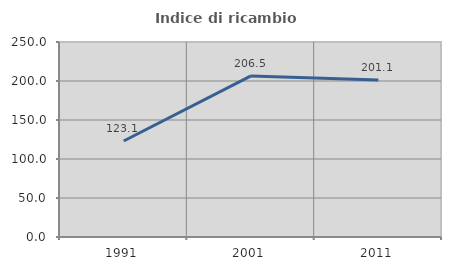
| Category | Indice di ricambio occupazionale  |
|---|---|
| 1991.0 | 123.077 |
| 2001.0 | 206.494 |
| 2011.0 | 201.124 |